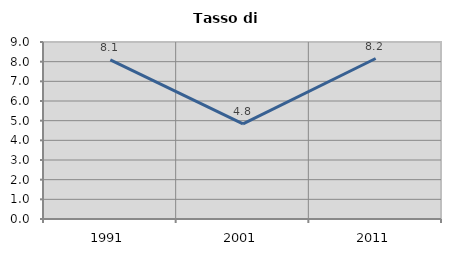
| Category | Tasso di disoccupazione   |
|---|---|
| 1991.0 | 8.088 |
| 2001.0 | 4.839 |
| 2011.0 | 8.16 |